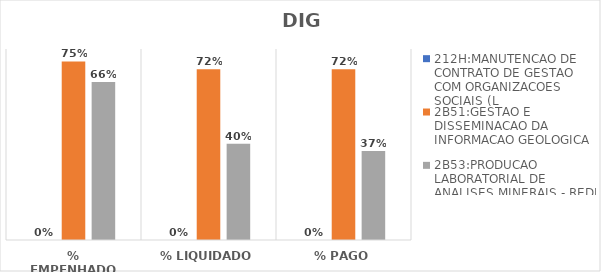
| Category | 212H:MANUTENCAO DE CONTRATO DE GESTAO COM ORGANIZACOES SOCIAIS (L | 2B51:GESTAO E DISSEMINACAO DA INFORMACAO GEOLOGICA | 2B53:PRODUCAO LABORATORIAL DE ANALISES MINERAIS - REDE LAMIN |
|---|---|---|---|
| % EMPENHADO | 0 | 0.748 | 0.662 |
| % LIQUIDADO | 0 | 0.715 | 0.404 |
| % PAGO | 0 | 0.715 | 0.372 |